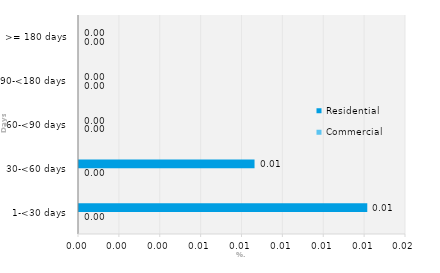
| Category | Commercial | Residential |
|---|---|---|
| 1-<30 days | 0 | 0.014 |
| 30-<60 days | 0 | 0.009 |
| 60-<90 days | 0 | 0 |
| 90-<180 days | 0 | 0 |
| >= 180 days | 0 | 0 |